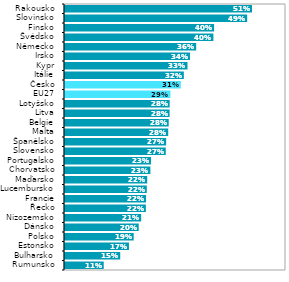
| Category | Series 1 |
|---|---|
| Rumunsko | 0.105 |
| Bulharsko | 0.15 |
| Estonsko | 0.174 |
| Polsko | 0.186 |
| Dánsko | 0.2 |
| Nizozemsko | 0.207 |
| Řecko | 0.22 |
| Francie | 0.22 |
| Lucembursko | 0.222 |
| Maďarsko | 0.223 |
| Chorvatsko | 0.232 |
| Portugalsko | 0.234 |
| Slovensko | 0.274 |
| Španělsko | 0.275 |
| Malta | 0.28 |
| Belgie | 0.282 |
| Litva | 0.284 |
| Lotyšsko | 0.284 |
| EU27 | 0.286 |
| Česko | 0.314 |
| Itálie | 0.323 |
| Kypr | 0.333 |
| Irsko | 0.339 |
| Německo | 0.356 |
| Švédsko | 0.403 |
| Finsko | 0.405 |
| Slovinsko | 0.495 |
| Rakousko | 0.508 |